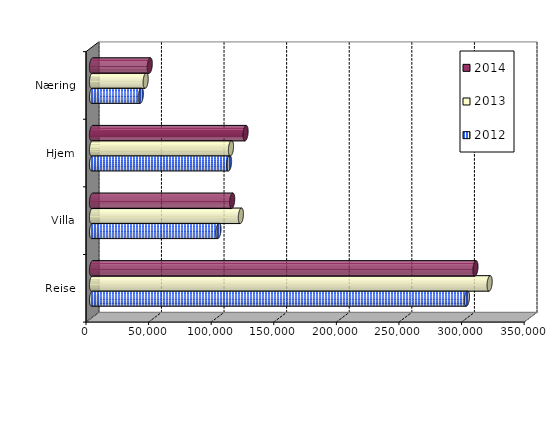
| Category | 2012 | 2013 | 2014 |
|---|---|---|---|
| Reise | 299510 | 317630 | 306308 |
| Villa | 100999 | 118928 | 111974 |
| Hjem | 109466 | 111027 | 122672 |
| Næring | 38994 | 42880 | 46146 |